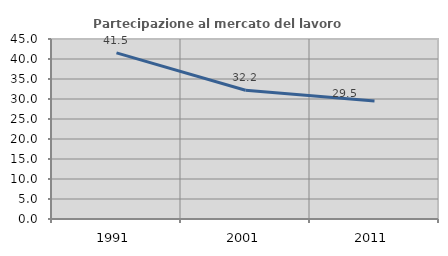
| Category | Partecipazione al mercato del lavoro  femminile |
|---|---|
| 1991.0 | 41.533 |
| 2001.0 | 32.179 |
| 2011.0 | 29.519 |